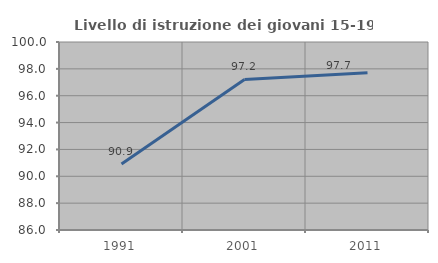
| Category | Livello di istruzione dei giovani 15-19 anni |
|---|---|
| 1991.0 | 90.909 |
| 2001.0 | 97.208 |
| 2011.0 | 97.712 |